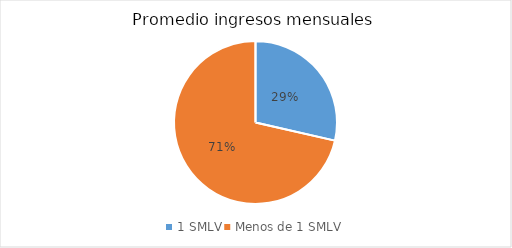
| Category | Series 0 |
|---|---|
| 1 SMLV | 2 |
| Menos de 1 SMLV | 5 |